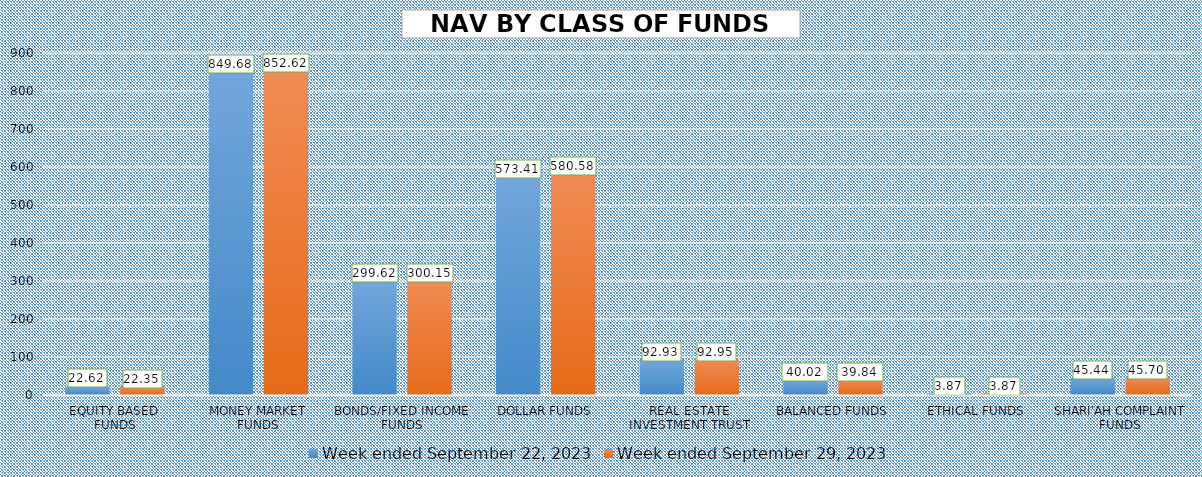
| Category | Week ended September 22, 2023 | Week ended September 29, 2023 |
|---|---|---|
| EQUITY BASED 
FUNDS | 22.617 | 22.347 |
| MONEY MARKET FUNDS | 849.678 | 852.625 |
| BONDS/FIXED INCOME FUNDS | 299.618 | 300.147 |
| DOLLAR FUNDS | 573.412 | 580.58 |
| REAL ESTATE INVESTMENT TRUST | 92.93 | 92.953 |
| BALANCED FUNDS | 40.018 | 39.836 |
| ETHICAL FUNDS | 3.869 | 3.872 |
| SHARI'AH COMPLAINT FUNDS | 45.443 | 45.697 |